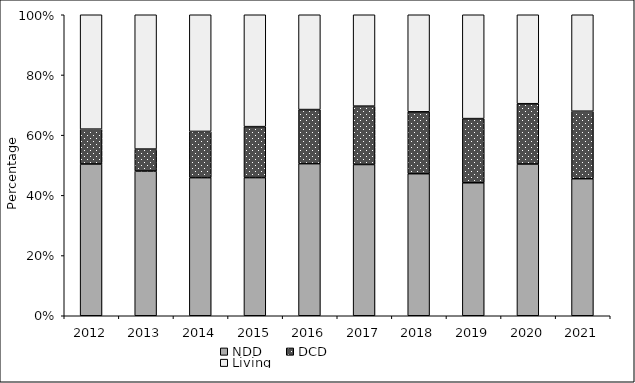
| Category | NDD | DCD | Living |
|---|---|---|---|
| 2012 | 540 | 124 | 407 |
| 2013 | 501 | 76 | 465 |
| 2014 | 496 | 166 | 419 |
| 2015 | 526 | 194 | 426 |
| 2016 | 669 | 238 | 417 |
| 2017 | 697 | 269 | 421 |
| 2018 | 647 | 282 | 442 |
| 2019 | 630 | 304 | 492 |
| 2020 | 614 | 244 | 360 |
| 2021 | 611 | 301 | 430 |